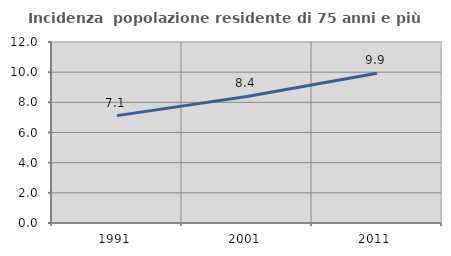
| Category | Incidenza  popolazione residente di 75 anni e più |
|---|---|
| 1991.0 | 7.119 |
| 2001.0 | 8.389 |
| 2011.0 | 9.926 |